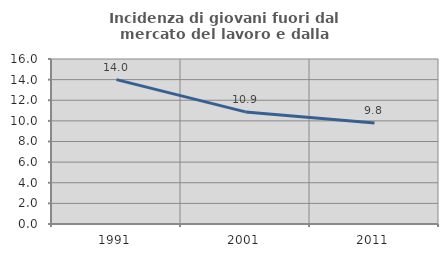
| Category | Incidenza di giovani fuori dal mercato del lavoro e dalla formazione  |
|---|---|
| 1991.0 | 14 |
| 2001.0 | 10.87 |
| 2011.0 | 9.804 |